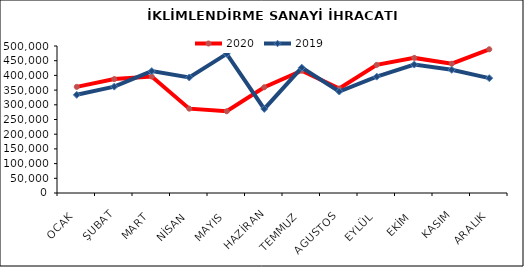
| Category | 2020 | 2019 |
|---|---|---|
| OCAK | 361004.432 | 333958.527 |
| ŞUBAT | 387530.143 | 361884.178 |
| MART | 396045.687 | 414615.43 |
| NİSAN | 286877.344 | 392857.45 |
| MAYIS | 278021.632 | 473189.055 |
| HAZİRAN | 359641.463 | 285953.992 |
| TEMMUZ | 416077.093 | 426248.674 |
| AGUSTOS | 355392.828 | 345201.185 |
| EYLÜL | 435822.382 | 395731.577 |
| EKİM | 459528.317 | 436835.82 |
| KASIM | 439727.248 | 419045.422 |
| ARALIK | 488814.839 | 390571.191 |